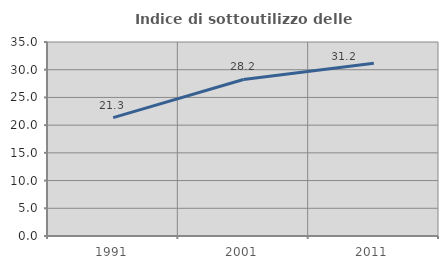
| Category | Indice di sottoutilizzo delle abitazioni  |
|---|---|
| 1991.0 | 21.346 |
| 2001.0 | 28.244 |
| 2011.0 | 31.158 |